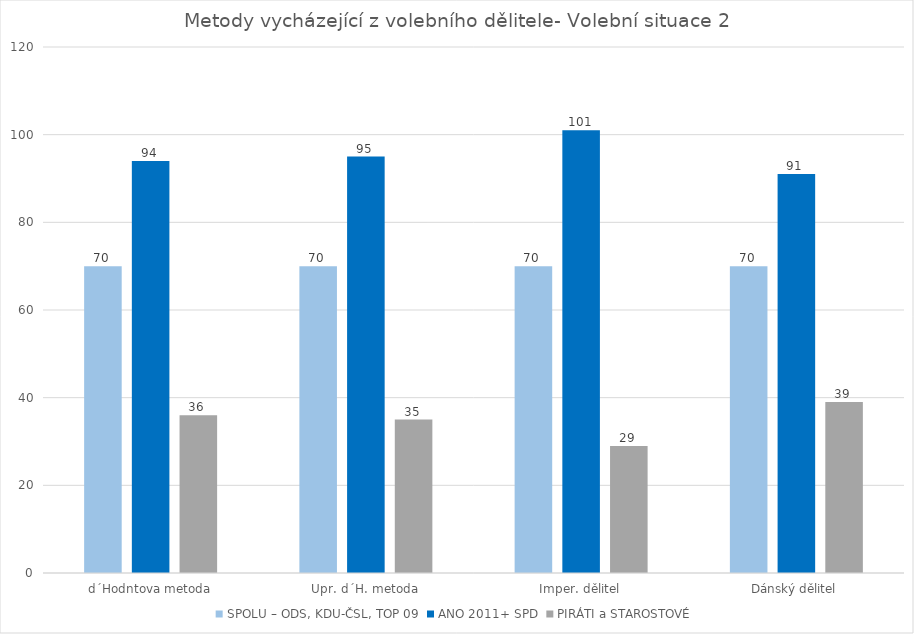
| Category | SPOLU – ODS, KDU-ČSL, TOP 09 | ANO 2011+ SPD | PIRÁTI a STAROSTOVÉ |
|---|---|---|---|
| d´Hodntova metoda | 70 | 94 | 36 |
| Upr. d´H. metoda | 70 | 95 | 35 |
| Imper. dělitel | 70 | 101 | 29 |
| Dánský dělitel | 70 | 91 | 39 |